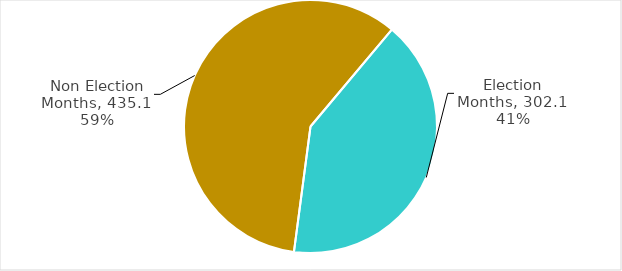
| Category | Total Grants |
|---|---|
| Election Months | 302.088 |
| Non Election Months | 435.103 |